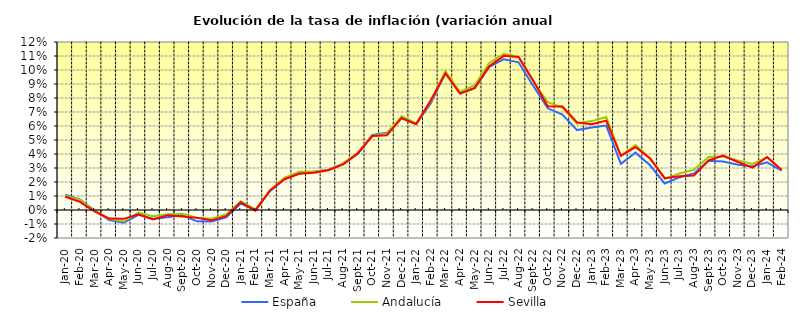
| Category | España | Andalucía | Sevilla |
|---|---|---|---|
| 2020-01-01 | 0.011 | 0.01 | 0.009 |
| 2020-02-01 | 0.007 | 0.007 | 0.006 |
| 2020-03-01 | 0 | 0 | -0.001 |
| 2020-04-01 | -0.007 | -0.006 | -0.006 |
| 2020-05-01 | -0.009 | -0.008 | -0.006 |
| 2020-06-01 | -0.003 | -0.002 | -0.003 |
| 2020-07-01 | -0.006 | -0.004 | -0.007 |
| 2020-08-01 | -0.005 | -0.003 | -0.004 |
| 2020-09-01 | -0.004 | -0.003 | -0.005 |
| 2020-10-01 | -0.008 | -0.005 | -0.006 |
| 2020-11-01 | -0.008 | -0.006 | -0.007 |
| 2020-12-01 | -0.005 | -0.003 | -0.004 |
| 2021-01-01 | 0.005 | 0.006 | 0.006 |
| 2021-02-01 | 0 | 0 | 0 |
| 2021-03-01 | 0.013 | 0.014 | 0.014 |
| 2021-04-01 | 0.022 | 0.023 | 0.022 |
| 2021-05-01 | 0.027 | 0.027 | 0.026 |
| 2021-06-01 | 0.027 | 0.027 | 0.027 |
| 2021-07-01 | 0.029 | 0.029 | 0.028 |
| 2021-08-01 | 0.033 | 0.033 | 0.033 |
| 2021-09-01 | 0.04 | 0.041 | 0.04 |
| 2021-10-01 | 0.054 | 0.053 | 0.053 |
| 2021-11-01 | 0.055 | 0.054 | 0.053 |
| 2021-12-01 | 0.065 | 0.067 | 0.066 |
| 2022-01-01 | 0.061 | 0.062 | 0.061 |
| 2022-02-01 | 0.076 | 0.078 | 0.078 |
| 2022-03-01 | 0.098 | 0.099 | 0.098 |
| 2022-04-01 | 0.083 | 0.084 | 0.083 |
| 2022-05-01 | 0.087 | 0.089 | 0.087 |
| 2022-06-01 | 0.102 | 0.105 | 0.103 |
| 2022-07-01 | 0.108 | 0.112 | 0.11 |
| 2022-08-01 | 0.105 | 0.109 | 0.109 |
| 2022-09-01 | 0.089 | 0.092 | 0.092 |
| 2022-10-01 | 0.073 | 0.077 | 0.074 |
| 2022-11-01 | 0.068 | 0.073 | 0.074 |
| 2022-12-01 | 0.057 | 0.062 | 0.063 |
| 2023-01-01 | 0.059 | 0.063 | 0.061 |
| 2023-02-01 | 0.06 | 0.066 | 0.064 |
| 2023-03-01 | 0.033 | 0.039 | 0.039 |
| 2023-04-01 | 0.041 | 0.046 | 0.045 |
| 2023-05-01 | 0.032 | 0.037 | 0.037 |
| 2023-06-01 | 0.019 | 0.022 | 0.023 |
| 2023-07-01 | 0.023 | 0.026 | 0.024 |
| 2023-08-01 | 0.026 | 0.029 | 0.025 |
| 2023-09-01 | 0.035 | 0.038 | 0.035 |
| 2023-10-01 | 0.035 | 0.038 | 0.039 |
| 2023-11-01 | 0.032 | 0.035 | 0.034 |
| 2023-12-01 | 0.031 | 0.033 | 0.03 |
| 2024-01-01 | 0.034 | 0.038 | 0.038 |
| 2024-02-01 | 0.028 | 0.029 | 0.029 |